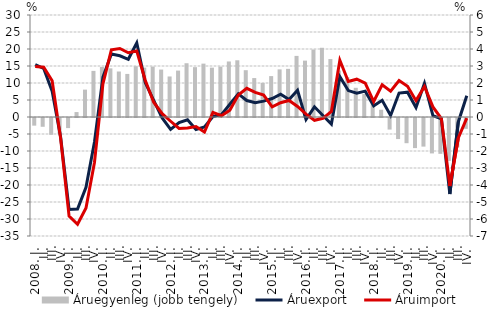
| Category | Áruegyenleg (jobb tengely) |
|---|---|
| 2008. I. | -0.45 |
|          II. | -0.517 |
|          III. | -0.986 |
|          IV. | -0.919 |
| 2009. I. | -0.594 |
|          II. | 0.29 |
|          III. | 1.61 |
|          IV. | 2.713 |
| 2010. I. | 2.944 |
|          II. | 2.862 |
|          III. | 2.676 |
|          IV. | 2.533 |
| 2011. I. | 2.989 |
|          II. | 2.903 |
|          III. | 2.968 |
|          IV. | 2.79 |
| 2012. I. | 2.384 |
|          II. | 2.73 |
|          III. | 3.163 |
|          IV. | 2.932 |
| 2013. I. | 3.14 |
| II. | 2.903 |
|          III. | 2.964 |
| IV. | 3.266 |
| 2014. I. | 3.336 |
| II. | 2.753 |
|          III. | 2.29 |
| IV. | 2.003 |
| 2015. I. | 2.406 |
| II. | 2.802 |
|          III. | 2.832 |
| IV. | 3.594 |
| 2016. I. | 3.316 |
| II. | 3.971 |
|          III. | 4.072 |
| IV. | 3.409 |
| 2017. I. | 2.731 |
| II. | 2.347 |
|          III. | 1.718 |
| IV. | 1.35 |
| 2018. I. | 1.126 |
| II. | 0.427 |
|          III. | -0.68 |
| IV. | -1.239 |
| 2019. I. | -1.482 |
| II. | -1.771 |
|          III. | -1.683 |
| IV. | -2.084 |
| 2020. I. | -2.108 |
| II. | -2.522 |
|          III. | -1.73 |
| IV. | -0.638 |